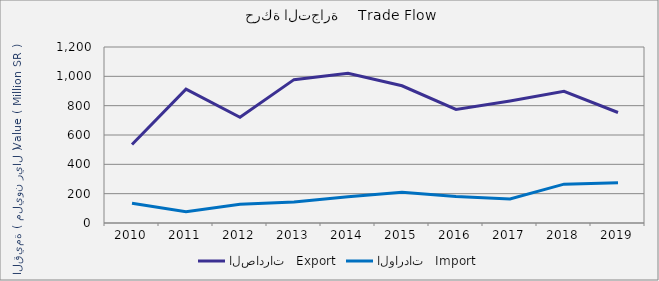
| Category | الصادرات   Export | الواردات   Import |
|---|---|---|
| 2010.0 | 535695449 | 134496483 |
| 2011.0 | 912948487 | 76872214 |
| 2012.0 | 721238086 | 128091843 |
| 2013.0 | 977430366 | 142451281 |
| 2014.0 | 1021172161 | 179458705 |
| 2015.0 | 935492823 | 208951504 |
| 2016.0 | 774687359 | 180337363 |
| 2017.0 | 832233720 | 164377328 |
| 2018.0 | 897296358 | 264959460 |
| 2019.0 | 753401718 | 274853216 |